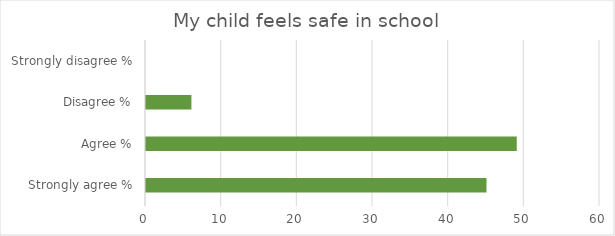
| Category | Series 1 |
|---|---|
| Strongly agree % | 45 |
| Agree % | 49 |
| Disagree % | 6 |
| Strongly disagree % | 0 |